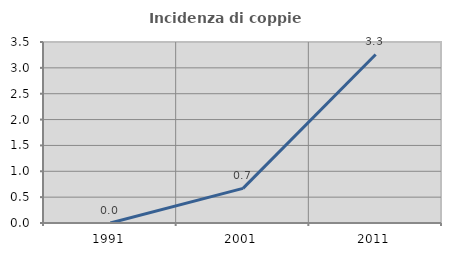
| Category | Incidenza di coppie miste |
|---|---|
| 1991.0 | 0 |
| 2001.0 | 0.67 |
| 2011.0 | 3.259 |